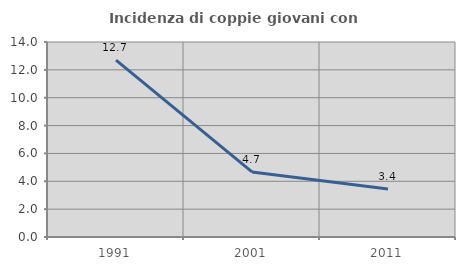
| Category | Incidenza di coppie giovani con figli |
|---|---|
| 1991.0 | 12.698 |
| 2001.0 | 4.673 |
| 2011.0 | 3.448 |